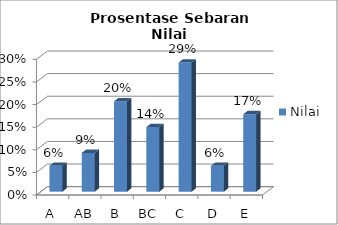
| Category | Nilai |
|---|---|
| A | 0.057 |
| AB | 0.086 |
| B | 0.2 |
| BC | 0.143 |
| C | 0.286 |
| D | 0.057 |
| E | 0.171 |